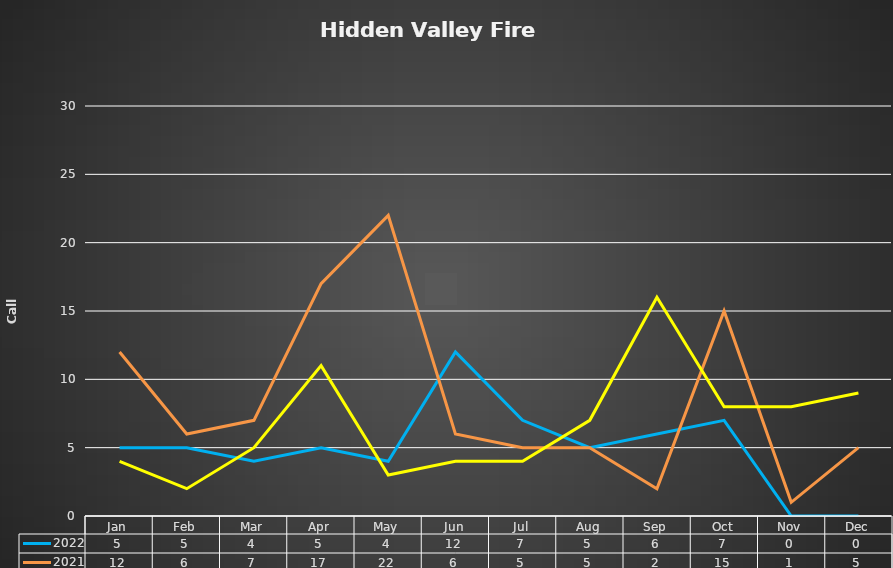
| Category | 2022 | 2021 | 2020 |
|---|---|---|---|
| 0 | 5 | 12 | 4 |
| 1 | 5 | 6 | 2 |
| 2 | 4 | 7 | 5 |
| 3 | 5 | 17 | 11 |
| 4 | 4 | 22 | 3 |
| 5 | 12 | 6 | 4 |
| 6 | 7 | 5 | 4 |
| 7 | 5 | 5 | 7 |
| 8 | 6 | 2 | 16 |
| 9 | 7 | 15 | 8 |
| 10 | 0 | 1 | 8 |
| 11 | 0 | 5 | 9 |